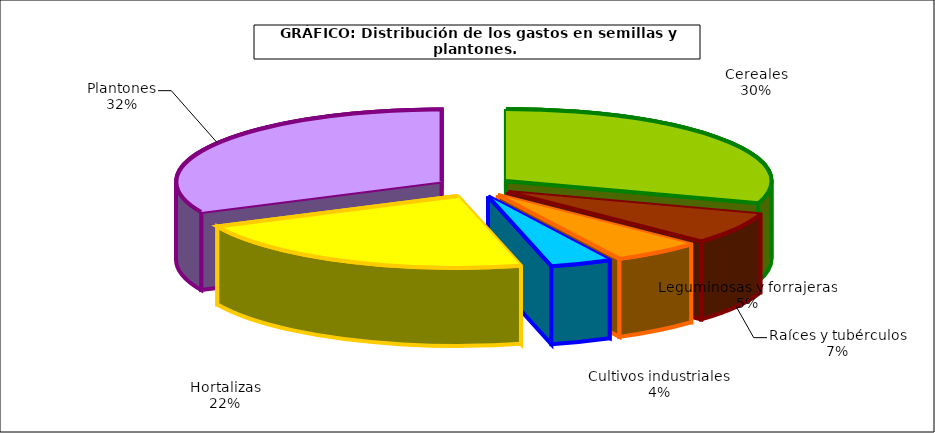
| Category | Series 0 |
|---|---|
| 0 | 317.025 |
| 1 | 73.898 |
| 2 | 57.081 |
| 3 | 39.5 |
| 4 | 230.576 |
| 5 | 337.793 |